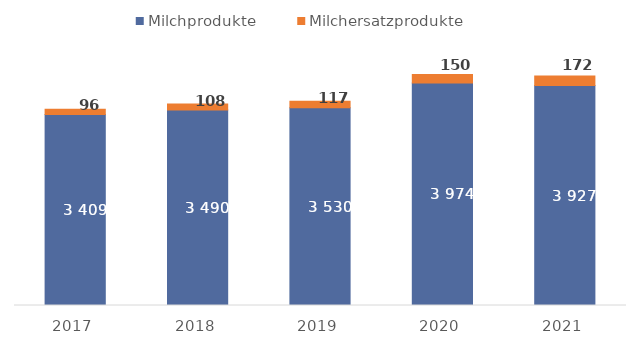
| Category | Milchprodukte | Milchersatzprodukte |
|---|---|---|
| 2017 | 3408.524 | 95.908 |
| 2018 | 3490.403 | 108.106 |
| 2019 | 3530.149 | 116.953 |
| 2020 | 3973.887 | 150.225 |
| 2021 | 3927.355 | 171.922 |